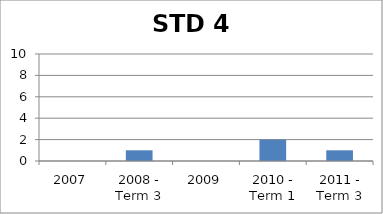
| Category | Rank |
|---|---|
| 2007 | 0 |
| 2008 - Term 3 | 1 |
| 2009 | 0 |
| 2010 - Term 1 | 2 |
| 2011 - Term 3 | 1 |